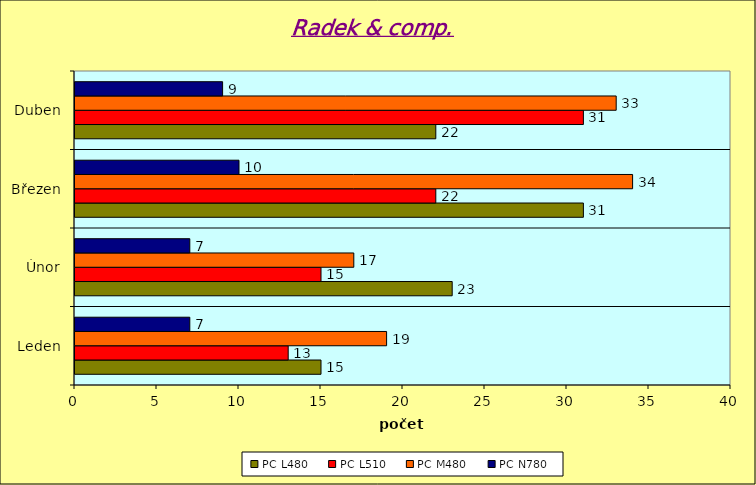
| Category | PC L480 | PC L510 | PC M480 | PC N780 |
|---|---|---|---|---|
| Leden | 15 | 13 | 19 | 7 |
| Únor | 23 | 15 | 17 | 7 |
| Březen | 31 | 22 | 34 | 10 |
| Duben | 22 | 31 | 33 | 9 |